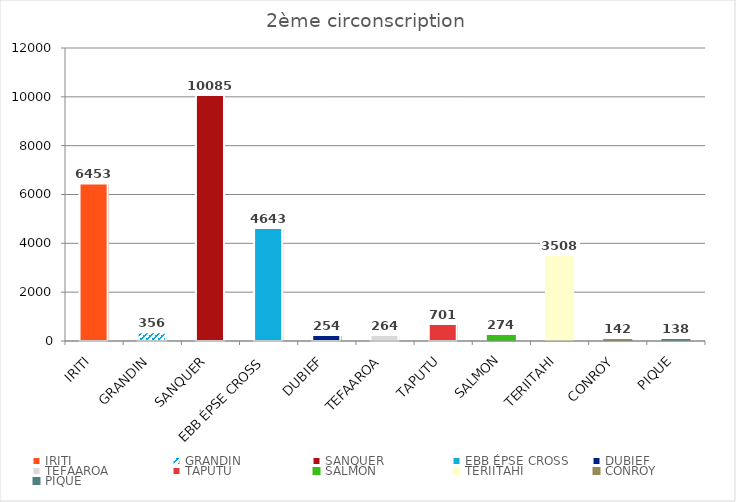
| Category | Series 0 |
|---|---|
| IRITI | 6453 |
| GRANDIN | 356 |
| SANQUER | 10085 |
| EBB ÉPSE CROSS | 4643 |
| DUBIEF | 254 |
| TEFAAROA | 264 |
| TAPUTU | 701 |
| SALMON | 274 |
| TERIITAHI | 3508 |
| CONROY | 142 |
| PIQUE | 138 |